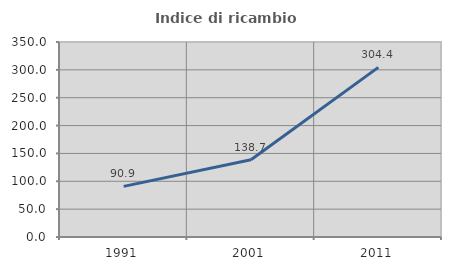
| Category | Indice di ricambio occupazionale  |
|---|---|
| 1991.0 | 90.909 |
| 2001.0 | 138.71 |
| 2011.0 | 304.444 |